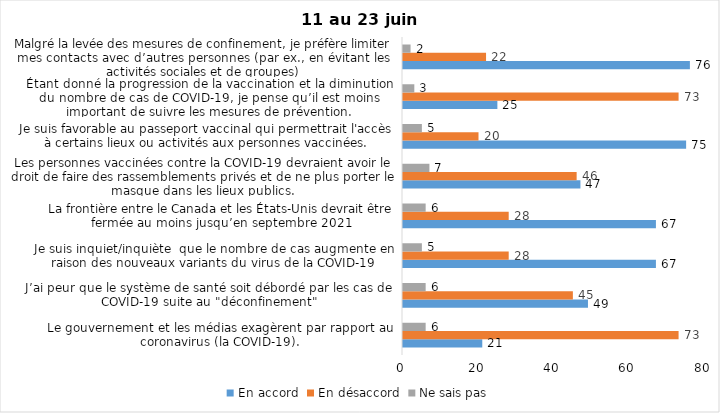
| Category | En accord | En désaccord | Ne sais pas |
|---|---|---|---|
| Le gouvernement et les médias exagèrent par rapport au coronavirus (la COVID-19). | 21 | 73 | 6 |
| J’ai peur que le système de santé soit débordé par les cas de COVID-19 suite au "déconfinement" | 49 | 45 | 6 |
| Je suis inquiet/inquiète  que le nombre de cas augmente en raison des nouveaux variants du virus de la COVID-19 | 67 | 28 | 5 |
| La frontière entre le Canada et les États-Unis devrait être fermée au moins jusqu’en septembre 2021 | 67 | 28 | 6 |
| Les personnes vaccinées contre la COVID-19 devraient avoir le droit de faire des rassemblements privés et de ne plus porter le masque dans les lieux publics. | 47 | 46 | 7 |
| Je suis favorable au passeport vaccinal qui permettrait l'accès à certains lieux ou activités aux personnes vaccinées. | 75 | 20 | 5 |
| Étant donné la progression de la vaccination et la diminution du nombre de cas de COVID-19, je pense qu’il est moins important de suivre les mesures de prévention. | 25 | 73 | 3 |
| Malgré la levée des mesures de confinement, je préfère limiter mes contacts avec d’autres personnes (par ex., en évitant les activités sociales et de groupes) | 76 | 22 | 2 |